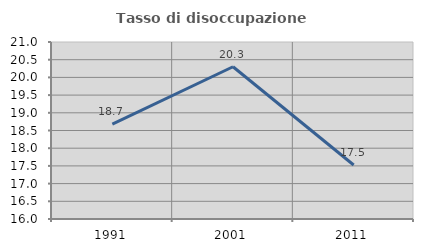
| Category | Tasso di disoccupazione giovanile  |
|---|---|
| 1991.0 | 18.681 |
| 2001.0 | 20.301 |
| 2011.0 | 17.526 |